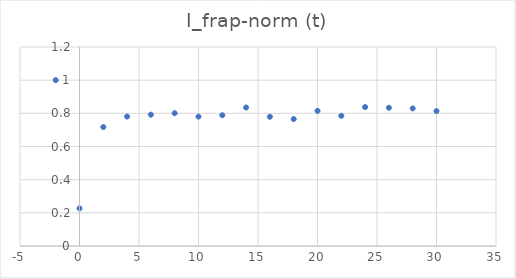
| Category | I_frap-norm (t) |
|---|---|
| -2.0 | 1 |
| 0.0 | 0.227 |
| 2.0 | 0.717 |
| 4.0 | 0.78 |
| 6.0 | 0.792 |
| 8.0 | 0.801 |
| 10.0 | 0.78 |
| 12.0 | 0.789 |
| 14.0 | 0.835 |
| 16.0 | 0.779 |
| 18.0 | 0.765 |
| 20.0 | 0.815 |
| 22.0 | 0.785 |
| 24.0 | 0.838 |
| 26.0 | 0.834 |
| 28.0 | 0.83 |
| 30.0 | 0.813 |